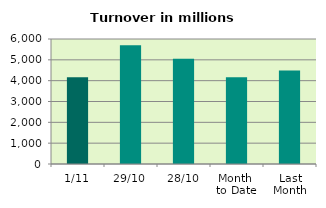
| Category | Series 0 |
|---|---|
| 1/11 | 4164.549 |
| 29/10 | 5704.244 |
| 28/10 | 5046.91 |
| Month 
to Date | 4164.549 |
| Last
Month | 4491.272 |